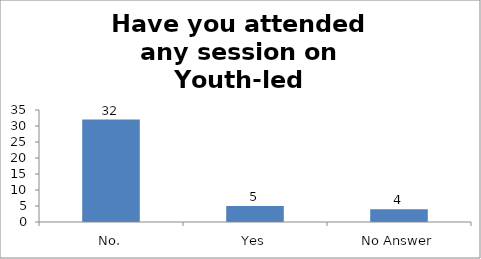
| Category | Have you attended any session on Youth-led Changemaking before? |
|---|---|
| No. | 32 |
| Yes | 5 |
| No Answer | 4 |